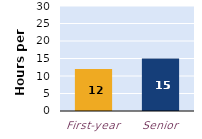
| Category | hours per week |
|---|---|
| First-year | 12 |
| Senior | 15 |